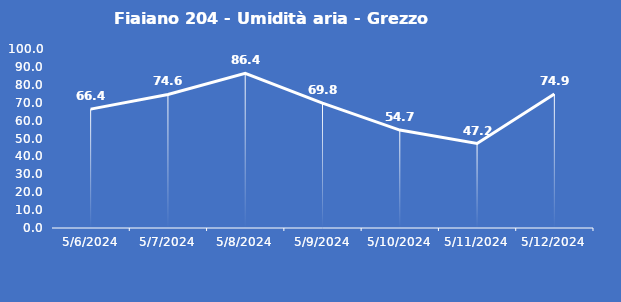
| Category | Fiaiano 204 - Umidità aria - Grezzo (%) |
|---|---|
| 5/6/24 | 66.4 |
| 5/7/24 | 74.6 |
| 5/8/24 | 86.4 |
| 5/9/24 | 69.8 |
| 5/10/24 | 54.7 |
| 5/11/24 | 47.2 |
| 5/12/24 | 74.9 |